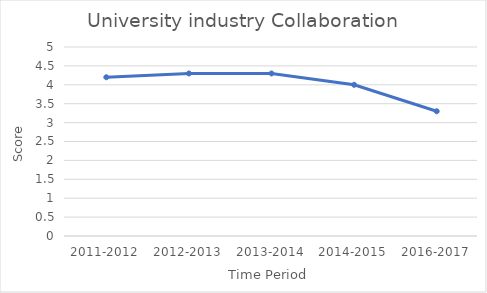
| Category | University industry Collaboration |
|---|---|
| 2011-2012 | 4.2 |
| 2012-2013 | 4.3 |
| 2013-2014 | 4.3 |
| 2014-2015 | 4 |
| 2016-2017 | 3.3 |